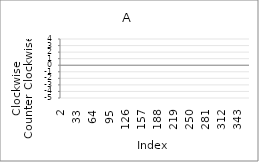
| Category | Series 0 |
|---|---|
| 2.0 | -1 |
| 3.0 | -3 |
| 4.0 | 1 |
| 5.0 | -3 |
| 6.0 | 4 |
| 7.0 | 1 |
| 8.0 | -1 |
| 9.0 | -4 |
| 10.0 | -4 |
| 11.0 | 3 |
| 12.0 | 1 |
| 13.0 | 3 |
| 14.0 | -5 |
| 15.0 | 1 |
| 16.0 | 0 |
| 17.0 | -2 |
| 18.0 | 4 |
| 19.0 | 3 |
| 20.0 | -3 |
| 21.0 | 1 |
| 22.0 | -3 |
| 23.0 | 4 |
| 24.0 | -1 |
| 25.0 | 0 |
| 26.0 | 4 |
| 27.0 | -1 |
| 28.0 | 0 |
| 29.0 | -1 |
| 30.0 | 0 |
| 31.0 | 99 |
| 32.0 | 99 |
| 33.0 | 99 |
| 34.0 | 99 |
| 35.0 | 99 |
| 36.0 | 99 |
| 37.0 | 99 |
| 38.0 | 99 |
| 39.0 | 99 |
| 40.0 | 99 |
| 41.0 | 99 |
| 42.0 | 99 |
| 43.0 | 99 |
| 44.0 | 99 |
| 45.0 | 99 |
| 46.0 | 99 |
| 47.0 | 99 |
| 48.0 | 99 |
| 49.0 | 99 |
| 50.0 | 99 |
| 51.0 | 99 |
| 52.0 | 99 |
| 53.0 | 99 |
| 54.0 | 99 |
| 55.0 | 99 |
| 56.0 | 99 |
| 57.0 | 99 |
| 58.0 | 99 |
| 59.0 | 99 |
| 60.0 | 99 |
| 61.0 | 99 |
| 62.0 | 99 |
| 63.0 | 99 |
| 64.0 | 99 |
| 65.0 | 99 |
| 66.0 | 99 |
| 67.0 | 99 |
| 68.0 | 99 |
| 69.0 | 99 |
| 70.0 | 99 |
| 71.0 | 99 |
| 72.0 | 99 |
| 73.0 | 99 |
| 74.0 | 99 |
| 75.0 | 99 |
| 76.0 | 99 |
| 77.0 | 99 |
| 78.0 | 99 |
| 79.0 | 99 |
| 80.0 | 99 |
| 81.0 | 99 |
| 82.0 | 99 |
| 83.0 | 99 |
| 84.0 | 99 |
| 85.0 | 99 |
| 86.0 | 99 |
| 87.0 | 99 |
| 88.0 | 99 |
| 89.0 | 99 |
| 90.0 | 99 |
| 91.0 | 99 |
| 92.0 | 99 |
| 93.0 | 99 |
| 94.0 | 99 |
| 95.0 | 99 |
| 96.0 | 99 |
| 97.0 | 99 |
| 98.0 | 99 |
| 99.0 | 99 |
| 100.0 | 99 |
| 101.0 | 99 |
| 102.0 | 99 |
| 103.0 | 99 |
| 104.0 | 99 |
| 105.0 | 99 |
| 106.0 | 99 |
| 107.0 | 99 |
| 108.0 | 99 |
| 109.0 | 99 |
| 110.0 | 99 |
| 111.0 | 99 |
| 112.0 | 99 |
| 113.0 | 99 |
| 114.0 | 99 |
| 115.0 | 99 |
| 116.0 | 99 |
| 117.0 | 99 |
| 118.0 | 99 |
| 119.0 | 99 |
| 120.0 | 99 |
| 121.0 | 99 |
| 122.0 | 99 |
| 123.0 | 99 |
| 124.0 | 99 |
| 125.0 | 99 |
| 126.0 | 99 |
| 127.0 | 99 |
| 128.0 | 99 |
| 129.0 | 99 |
| 130.0 | 99 |
| 131.0 | 99 |
| 132.0 | 99 |
| 133.0 | 99 |
| 134.0 | 99 |
| 135.0 | 99 |
| 136.0 | 99 |
| 137.0 | 99 |
| 138.0 | 99 |
| 139.0 | 99 |
| 140.0 | 99 |
| 141.0 | 99 |
| 142.0 | 99 |
| 143.0 | 99 |
| 144.0 | 99 |
| 145.0 | 99 |
| 146.0 | 99 |
| 147.0 | 99 |
| 148.0 | 99 |
| 149.0 | 99 |
| 150.0 | 99 |
| 151.0 | 99 |
| 152.0 | 99 |
| 153.0 | 99 |
| 154.0 | 99 |
| 155.0 | 99 |
| 156.0 | 99 |
| 157.0 | 99 |
| 158.0 | 99 |
| 159.0 | 99 |
| 160.0 | 99 |
| 161.0 | 99 |
| 162.0 | 99 |
| 163.0 | 99 |
| 164.0 | 99 |
| 165.0 | 99 |
| 166.0 | 99 |
| 167.0 | 99 |
| 168.0 | 99 |
| 169.0 | 99 |
| 170.0 | 99 |
| 171.0 | 99 |
| 172.0 | 99 |
| 173.0 | 99 |
| 174.0 | 99 |
| 175.0 | 99 |
| 176.0 | 99 |
| 177.0 | 99 |
| 178.0 | 99 |
| 179.0 | 99 |
| 180.0 | 99 |
| 181.0 | 99 |
| 182.0 | 99 |
| 183.0 | 99 |
| 184.0 | 99 |
| 185.0 | 99 |
| 186.0 | 99 |
| 187.0 | 99 |
| 188.0 | 99 |
| 189.0 | 99 |
| 190.0 | 99 |
| 191.0 | 99 |
| 192.0 | 99 |
| 193.0 | 99 |
| 194.0 | 99 |
| 195.0 | 99 |
| 196.0 | 99 |
| 197.0 | 99 |
| 198.0 | 99 |
| 199.0 | 99 |
| 200.0 | 99 |
| 201.0 | 99 |
| 202.0 | 99 |
| 203.0 | 99 |
| 204.0 | 99 |
| 205.0 | 99 |
| 206.0 | 99 |
| 207.0 | 99 |
| 208.0 | 99 |
| 209.0 | 99 |
| 210.0 | 99 |
| 211.0 | 99 |
| 212.0 | 99 |
| 213.0 | 99 |
| 214.0 | 99 |
| 215.0 | 99 |
| 216.0 | 99 |
| 217.0 | 99 |
| 218.0 | 99 |
| 219.0 | 99 |
| 220.0 | 99 |
| 221.0 | 99 |
| 222.0 | 99 |
| 223.0 | 99 |
| 224.0 | 99 |
| 225.0 | 99 |
| 226.0 | 99 |
| 227.0 | 99 |
| 228.0 | 99 |
| 229.0 | 99 |
| 230.0 | 99 |
| 231.0 | 99 |
| 232.0 | 99 |
| 233.0 | 99 |
| 234.0 | 99 |
| 235.0 | 99 |
| 236.0 | 99 |
| 237.0 | 99 |
| 238.0 | 99 |
| 239.0 | 99 |
| 240.0 | 99 |
| 241.0 | 99 |
| 242.0 | 99 |
| 243.0 | 99 |
| 244.0 | 99 |
| 245.0 | 99 |
| 246.0 | 99 |
| 247.0 | 99 |
| 248.0 | 99 |
| 249.0 | 99 |
| 250.0 | 99 |
| 251.0 | 99 |
| 252.0 | 99 |
| 253.0 | 99 |
| 254.0 | 99 |
| 255.0 | 99 |
| 256.0 | 99 |
| 257.0 | 99 |
| 258.0 | 99 |
| 259.0 | 99 |
| 260.0 | 99 |
| 261.0 | 99 |
| 262.0 | 99 |
| 263.0 | 99 |
| 264.0 | 99 |
| 265.0 | 99 |
| 266.0 | 99 |
| 267.0 | 99 |
| 268.0 | 99 |
| 269.0 | 99 |
| 270.0 | 99 |
| 271.0 | 99 |
| 272.0 | 99 |
| 273.0 | 99 |
| 274.0 | 99 |
| 275.0 | 99 |
| 276.0 | 99 |
| 277.0 | 99 |
| 278.0 | 99 |
| 279.0 | 99 |
| 280.0 | 99 |
| 281.0 | 99 |
| 282.0 | 99 |
| 283.0 | 99 |
| 284.0 | 99 |
| 285.0 | 99 |
| 286.0 | 99 |
| 287.0 | 99 |
| 288.0 | 99 |
| 289.0 | 99 |
| 290.0 | 99 |
| 291.0 | 99 |
| 292.0 | 99 |
| 293.0 | 99 |
| 294.0 | 99 |
| 295.0 | 99 |
| 296.0 | 99 |
| 297.0 | 99 |
| 298.0 | 99 |
| 299.0 | 99 |
| 300.0 | 99 |
| 301.0 | 99 |
| 302.0 | 99 |
| 303.0 | 99 |
| 304.0 | 99 |
| 305.0 | 99 |
| 306.0 | 99 |
| 307.0 | 99 |
| 308.0 | 99 |
| 309.0 | 99 |
| 310.0 | 99 |
| 311.0 | 99 |
| 312.0 | 99 |
| 313.0 | 99 |
| 314.0 | 99 |
| 315.0 | 99 |
| 316.0 | 99 |
| 317.0 | 99 |
| 318.0 | 99 |
| 319.0 | 99 |
| 320.0 | 99 |
| 321.0 | 99 |
| 322.0 | 99 |
| 323.0 | 99 |
| 324.0 | 99 |
| 325.0 | 99 |
| 326.0 | 99 |
| 327.0 | 99 |
| 328.0 | 99 |
| 329.0 | 99 |
| 330.0 | 99 |
| 331.0 | 99 |
| 332.0 | 99 |
| 333.0 | 99 |
| 334.0 | 99 |
| 335.0 | 99 |
| 336.0 | 99 |
| 337.0 | 99 |
| 338.0 | 99 |
| 339.0 | 99 |
| 340.0 | 99 |
| 341.0 | 99 |
| 342.0 | 99 |
| 343.0 | 99 |
| 344.0 | 99 |
| 345.0 | 99 |
| 346.0 | 99 |
| 347.0 | 99 |
| 348.0 | 99 |
| 349.0 | 99 |
| 350.0 | 99 |
| 351.0 | 99 |
| 352.0 | 99 |
| 353.0 | 99 |
| 354.0 | 99 |
| 355.0 | 99 |
| 356.0 | 99 |
| 357.0 | 99 |
| 358.0 | 99 |
| 359.0 | 99 |
| 360.0 | 99 |
| 361.0 | 99 |
| 362.0 | 99 |
| 363.0 | 99 |
| 364.0 | 99 |
| 365.0 | 99 |